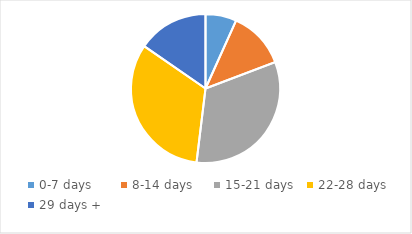
| Category | Series 0 |
|---|---|
| 0-7 days | 0.067 |
| 8-14 days | 0.125 |
| 15-21 days | 0.327 |
| 22-28 days | 0.327 |
| 29 days + | 0.154 |